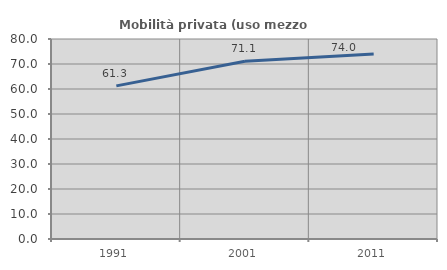
| Category | Mobilità privata (uso mezzo privato) |
|---|---|
| 1991.0 | 61.254 |
| 2001.0 | 71.128 |
| 2011.0 | 73.992 |